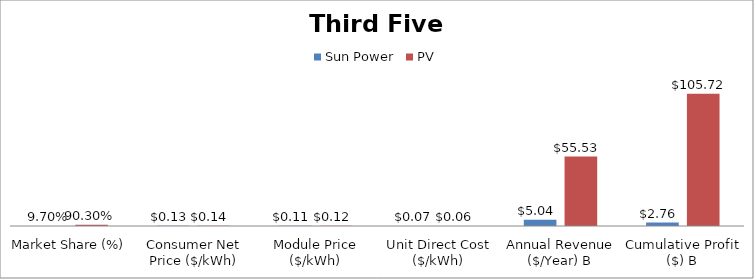
| Category | Sun Power | PV |
|---|---|---|
| Market Share (%) | 0.097 | 0.903 |
| Consumer Net Price ($/kWh) | 0.13 | 0.14 |
| Module Price ($/kWh) | 0.11 | 0.12 |
| Unit Direct Cost ($/kWh) | 0.07 | 0.06 |
| Annual Revenue ($/Year) B | 5.04 | 55.53 |
| Cumulative Profit ($) B | 2.76 | 105.72 |